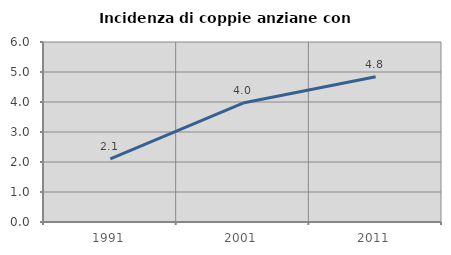
| Category | Incidenza di coppie anziane con figli |
|---|---|
| 1991.0 | 2.108 |
| 2001.0 | 3.965 |
| 2011.0 | 4.844 |